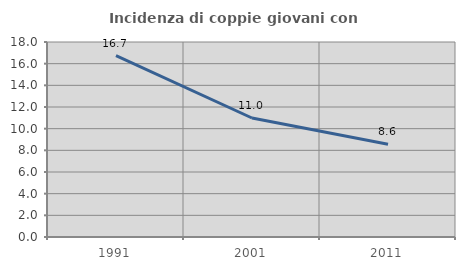
| Category | Incidenza di coppie giovani con figli |
|---|---|
| 1991.0 | 16.749 |
| 2001.0 | 10.985 |
| 2011.0 | 8.567 |